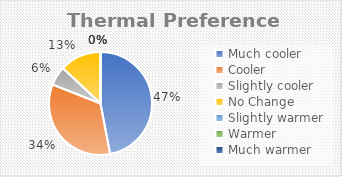
| Category | Series 0 |
|---|---|
| Much cooler | 0.47 |
| Cooler | 0.34 |
| Slightly cooler | 0.06 |
| No Change  | 0.13 |
| Slightly warmer | 0 |
| Warmer | 0 |
| Much warmer | 0 |